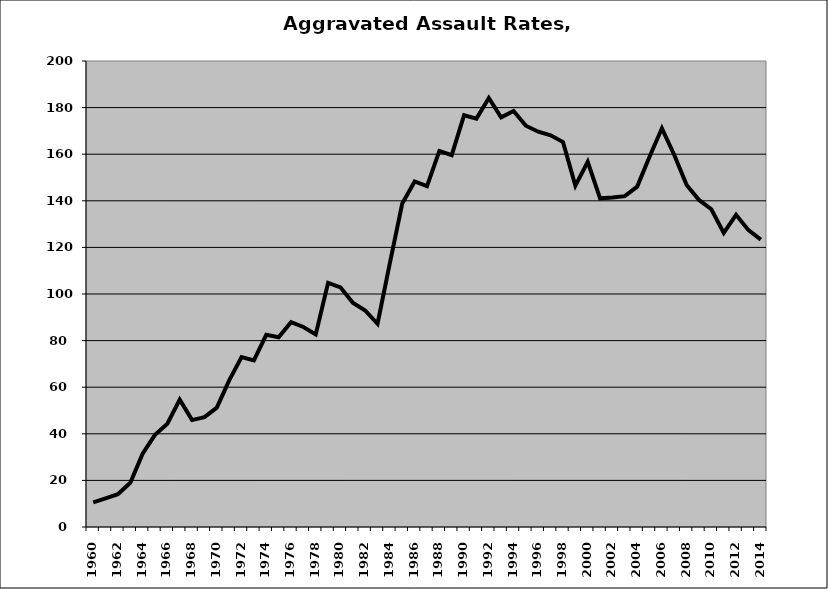
| Category | Aggravated Assault |
|---|---|
| 1960.0 | 10.604 |
| 1961.0 | 12.277 |
| 1962.0 | 14.072 |
| 1963.0 | 19 |
| 1964.0 | 31.468 |
| 1965.0 | 39.533 |
| 1966.0 | 44.351 |
| 1967.0 | 54.662 |
| 1968.0 | 45.886 |
| 1969.0 | 47.135 |
| 1970.0 | 51.221 |
| 1971.0 | 62.948 |
| 1972.0 | 72.947 |
| 1973.0 | 71.465 |
| 1974.0 | 82.461 |
| 1975.0 | 81.431 |
| 1976.0 | 87.894 |
| 1977.0 | 85.836 |
| 1978.0 | 82.635 |
| 1979.0 | 104.803 |
| 1980.0 | 102.85 |
| 1981.0 | 96.259 |
| 1982.0 | 92.935 |
| 1983.0 | 87.235 |
| 1984.0 | 113.335 |
| 1985.0 | 138.874 |
| 1986.0 | 148.291 |
| 1987.0 | 146.326 |
| 1988.0 | 161.403 |
| 1989.0 | 159.591 |
| 1990.0 | 176.705 |
| 1991.0 | 175.271 |
| 1992.0 | 184.107 |
| 1993.0 | 175.847 |
| 1994.0 | 178.564 |
| 1995.0 | 172.213 |
| 1996.0 | 169.665 |
| 1997.0 | 168.139 |
| 1998.0 | 165.206 |
| 1999.0 | 146.498 |
| 2000.0 | 156.704 |
| 2001.0 | 141.076 |
| 2002.0 | 141.419 |
| 2003.0 | 141.998 |
| 2004.0 | 146.079 |
| 2005.0 | 158.892 |
| 2006.0 | 171.121 |
| 2007.0 | 159.65 |
| 2008.0 | 146.791 |
| 2009.0 | 140.366 |
| 2010.0 | 136.371 |
| 2011.0 | 126.232 |
| 2012.0 | 133.968 |
| 2013.0 | 127.405 |
| 2014.0 | 123.306 |